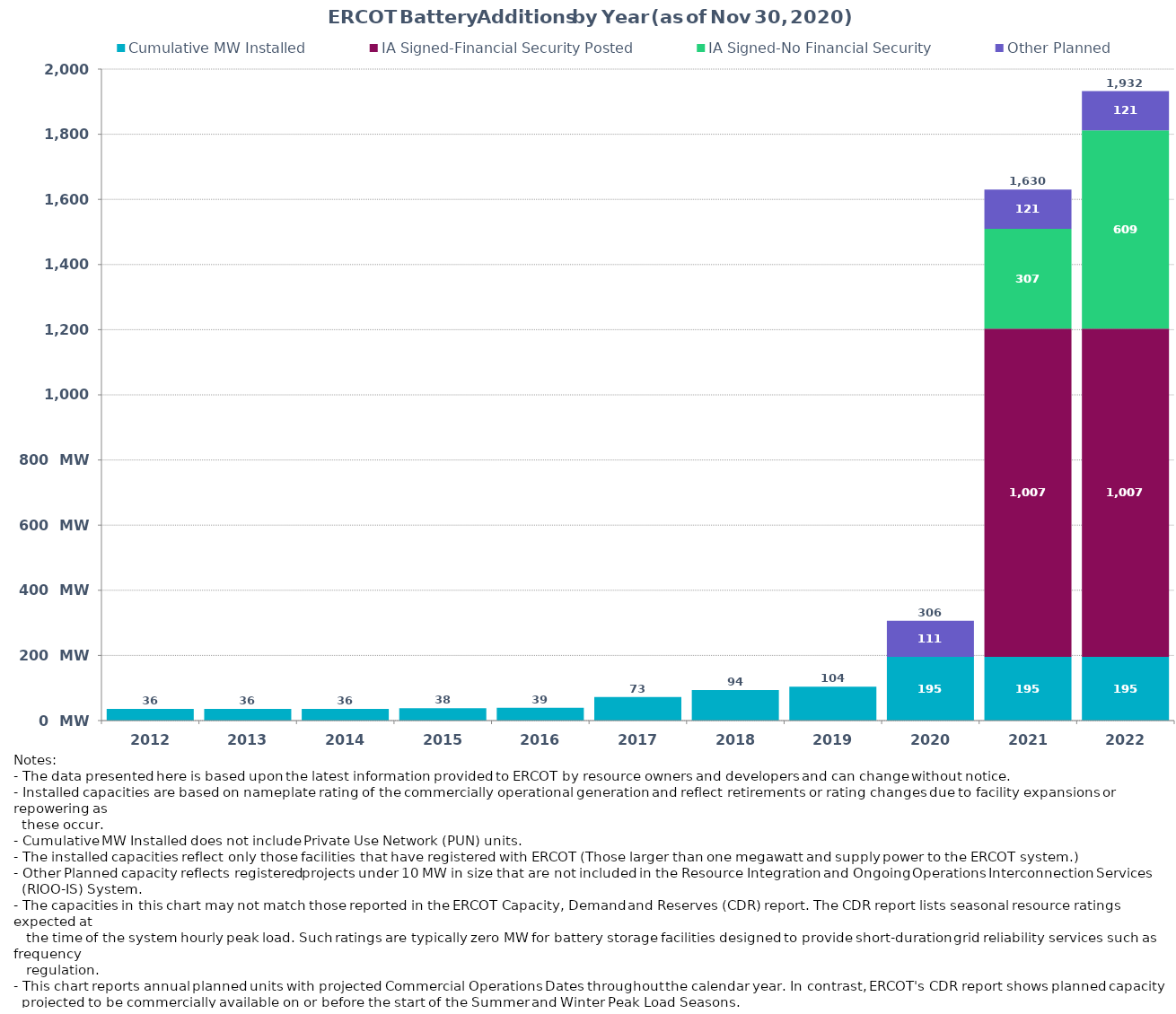
| Category | Cumulative MW Installed | Cumulative MW Synchronized | IA Signed-Financial Security Posted  | IA Signed-No Financial Security  | Other Planned | Cumulative Installed and Planned |
|---|---|---|---|---|---|---|
| 2012.0 | 36 | 0 | 0 | 0 | 0 | 36 |
| 2013.0 | 36 | 0 | 0 | 0 | 0 | 36 |
| 2014.0 | 36 | 0 | 0 | 0 | 0 | 36 |
| 2015.0 | 38 | 0 | 0 | 0 | 0 | 38 |
| 2016.0 | 39 | 0 | 0 | 0 | 0 | 39 |
| 2017.0 | 72.5 | 0 | 0 | 0 | 0 | 72.5 |
| 2018.0 | 93.8 | 0 | 0 | 0 | 0 | 93.8 |
| 2019.0 | 103.7 | 0 | 0 | 0 | 0 | 103.7 |
| 2020.0 | 195.4 | 0 | 0 | 0 | 111 | 306.4 |
| 2021.0 | 195.4 | 0 | 1007.46 | 306.97 | 120.58 | 1630.41 |
| 2022.0 | 195.4 | 0 | 1007.46 | 609 | 120.58 | 1932.44 |